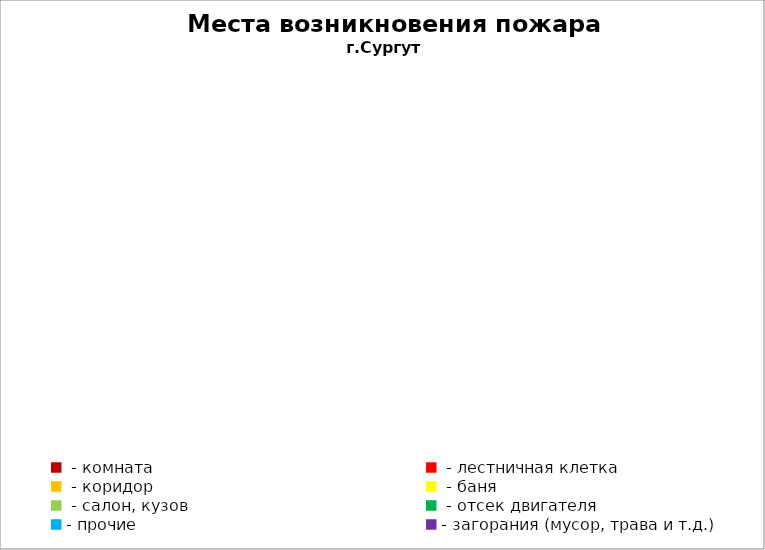
| Category | Места возникновения пожара |
|---|---|
|  - комната | 21 |
|  - лестничная клетка | 11 |
|  - коридор | 1 |
|  - баня | 12 |
|  - салон, кузов | 8 |
|  - отсек двигателя | 19 |
| - прочие | 29 |
| - загорания (мусор, трава и т.д.)  | 23 |